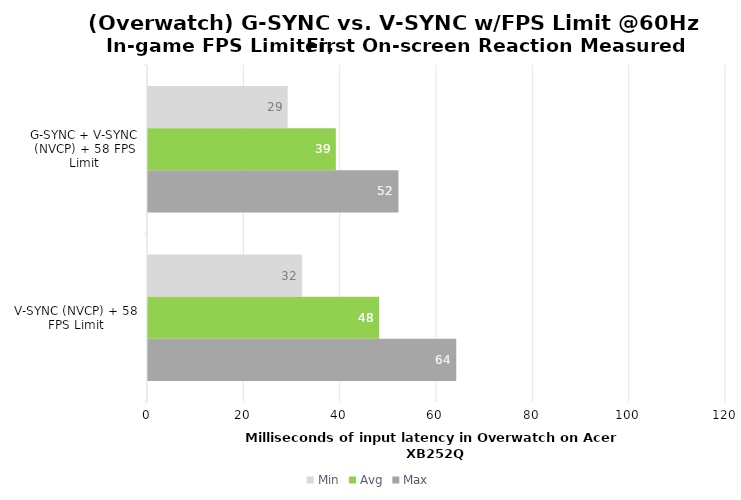
| Category | Min | Avg | Max |
|---|---|---|---|
| G-SYNC + V-SYNC (NVCP) + 58 FPS Limit | 29 | 39 | 52 |
| V-SYNC (NVCP) + 58 FPS Limit | 32 | 48 | 64 |